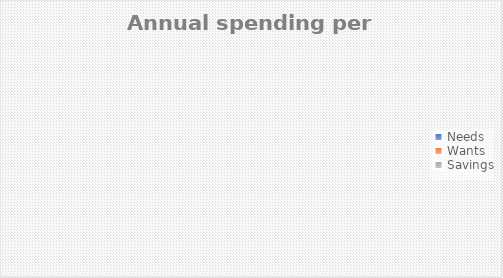
| Category | Series 0 |
|---|---|
| Needs  | 0 |
| Wants | 0 |
| Savings | 0 |